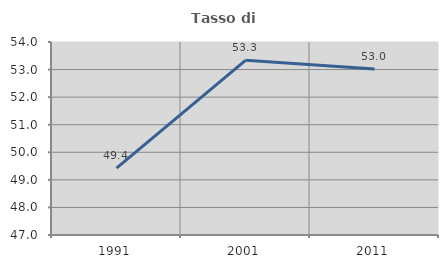
| Category | Tasso di occupazione   |
|---|---|
| 1991.0 | 49.423 |
| 2001.0 | 53.336 |
| 2011.0 | 53.018 |